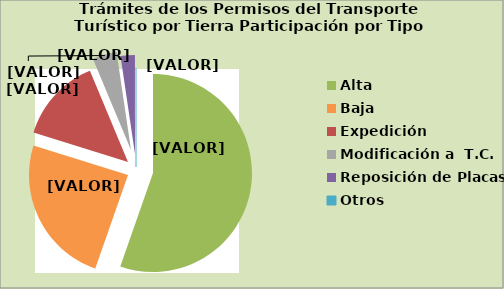
| Category | Series 0 |
|---|---|
| Alta                                         | 55.365 |
| Baja | 24.443 |
| Expedición | 13.902 |
| Modificación a  T.C. | 3.951 |
| Reposición de Placas | 2.326 |
| Otros | 0.011 |